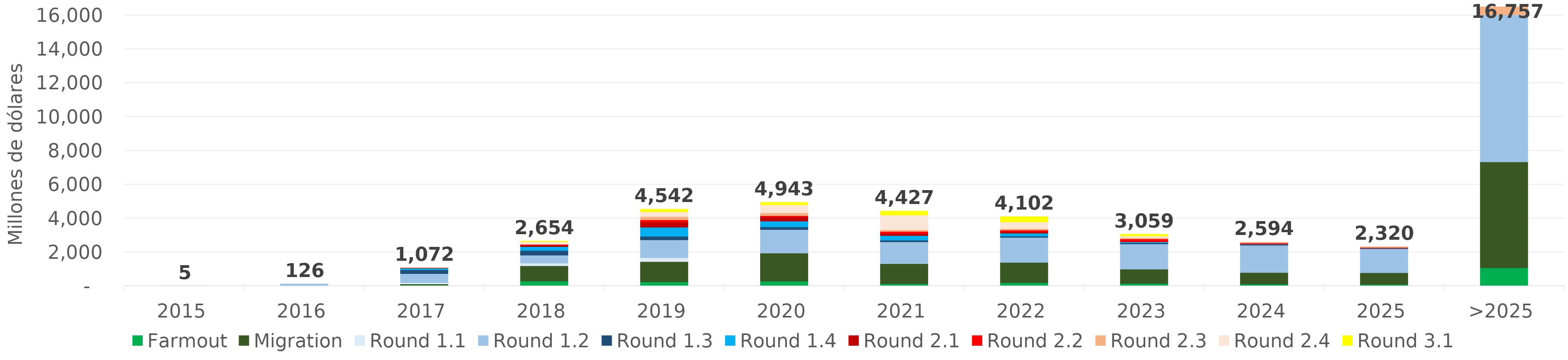
| Category | Farmout | Migration | Round 1.1 | Round 1.2 | Round 1.3 | Round 1.4 | Round 2.1 | Round 2.2 | Round 2.3 | Round 2.4 | Round 3.1 |
|---|---|---|---|---|---|---|---|---|---|---|---|
| 2015 | 0 | 0 | 4.573 | 0.236 | 0 | 0 | 0 | 0 | 0 | 0 | 0 |
| 2016 | 0 | 0 | 16.79 | 108.909 | 0 | 0 | 0 | 0 | 0 | 0 | 0 |
| 2017 | 50.877 | 65.422 | 76.429 | 533.486 | 231.789 | 93.443 | 18.851 | 1.29 | 0.72 | 0 | 0 |
| 2018 | 289.394 | 902.921 | 155.042 | 470.128 | 278.302 | 226.903 | 104.896 | 21.902 | 26.974 | 139.641 | 37.691 |
| 2019 | 241.207 | 1195.818 | 236.68 | 1049.68 | 207.126 | 540.649 | 302.09 | 133.009 | 199.161 | 270.262 | 166.186 |
| 2020 | 284.321 | 1655.641 | 6.736 | 1382.287 | 161.213 | 341.057 | 252.645 | 70.216 | 163.112 | 477.469 | 148.013 |
| 2021 | 127.797 | 1192.243 | 2.229 | 1284.713 | 97.796 | 274.593 | 106.762 | 133.184 | 98.223 | 870.647 | 238.989 |
| 2022 | 194.279 | 1192.976 | 0 | 1478.874 | 76.421 | 171.379 | 103.447 | 87.487 | 76.405 | 397.454 | 323.017 |
| 2023 | 149.166 | 842.772 | 0 | 1490.693 | 68.336 | 59.302 | 0.019 | 172.473 | 64.908 | 104.985 | 105.864 |
| 2024 | 102.681 | 691.937 | 0 | 1611.631 | 57.216 | 10.68 | 0 | 65.107 | 53.145 | 1.529 | 0 |
| 2025 | 89.748 | 692.667 | 0 | 1414.16 | 37.877 | 5.238 | 0 | 35.777 | 44.551 | 0 | 0 |
| >2025 | 1066.13 | 6262.668 | 0 | 8795.067 | 310.453 | 0 | 0 | 95.608 | 226.914 | 0 | 0 |